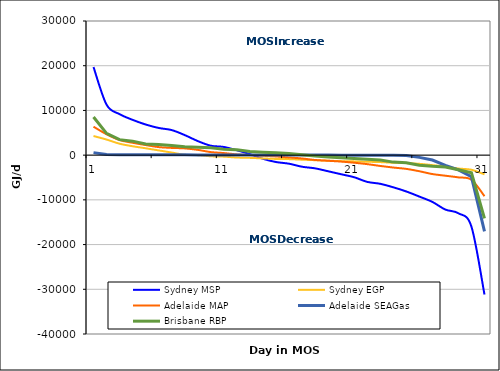
| Category | Sydney MSP | Sydney EGP | Adelaide MAP | Adelaide SEAGas | Brisbane RBP |
|---|---|---|---|---|---|
| 0 | 19702 | 4276.733 | 6361 | 564 | 8538 |
| 1 | 11293 | 3485.635 | 4669 | 136 | 4879 |
| 2 | 9174 | 2553.44 | 3372 | 96 | 3464 |
| 3 | 7892 | 1989.534 | 2766 | 85 | 3129 |
| 4 | 6853 | 1538.873 | 2254 | 78 | 2510 |
| 5 | 6079 | 1058.615 | 1799 | 69 | 2368 |
| 6 | 5607 | 584.171 | 1619 | 65 | 2175 |
| 7 | 4485 | 74.886 | 1511 | 62 | 1876 |
| 8 | 3147 | 2.75 | 1183 | 53 | 1775 |
| 9 | 2109 | -254.219 | 684 | 50 | 1645 |
| 10 | 1830 | -337.707 | 467 | 46 | 1343 |
| 11 | 1088 | -532.41 | 166 | 40 | 1218 |
| 12 | 233 | -610.146 | 9 | 35 | 826 |
| 13 | -824 | -731.325 | -140 | 25 | 660 |
| 14 | -1537 | -849.475 | -296 | 20 | 543 |
| 15 | -1913 | -890.821 | -514 | 18 | 370 |
| 16 | -2591 | -1017.322 | -745 | 11 | 114 |
| 17 | -2952 | -1130.255 | -1082 | 7 | -200 |
| 18 | -3605 | -1237.644 | -1259 | 4 | -415 |
| 19 | -4271 | -1338.282 | -1438 | 1 | -609 |
| 20 | -4941 | -1394.882 | -1694 | 0 | -748 |
| 21 | -5979 | -1480.805 | -2012 | -2 | -914 |
| 22 | -6410 | -1553.777 | -2418 | -6 | -1093 |
| 23 | -7190 | -1700.103 | -2773 | -8 | -1559 |
| 24 | -8125 | -1779.958 | -3073 | -81 | -1704 |
| 25 | -9267 | -1940.758 | -3599 | -497 | -2244 |
| 26 | -10455 | -2232.682 | -4230 | -1094 | -2509 |
| 27 | -12177 | -2560 | -4601 | -2271 | -2657 |
| 28 | -13000 | -2993.865 | -4973 | -3301 | -3274 |
| 29 | -16003 | -3269.197 | -5502 | -4843 | -3934 |
| 30 | -31169 | -4299.391 | -9182 | -17065 | -14142 |